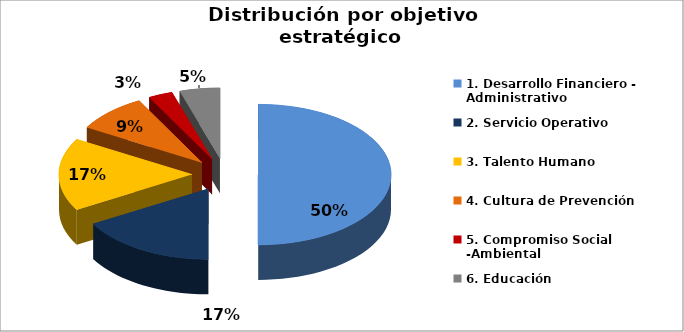
| Category | Series 0 |
|---|---|
| 1. Desarrollo Financiero - Administrativo  | 51 |
| 2. Servicio Operativo | 17 |
| 3. Talento Humano | 17 |
| 4. Cultura de Prevención | 9 |
| 5. Compromiso Social -Ambiental | 3 |
| 6. Educación  | 5 |